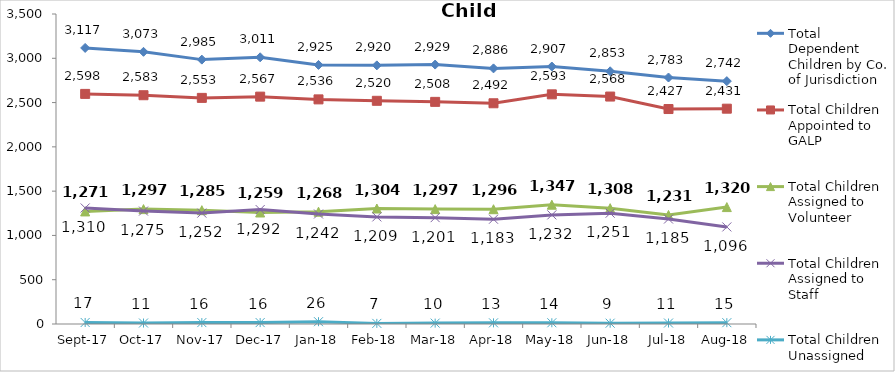
| Category | Total Dependent Children by Co. of Jurisdiction | Total Children Appointed to GALP | Total Children Assigned to Volunteer | Total Children Assigned to Staff | Total Children Unassigned |
|---|---|---|---|---|---|
| 2017-09-01 | 3117 | 2598 | 1271 | 1310 | 17 |
| 2017-10-01 | 3073 | 2583 | 1297 | 1275 | 11 |
| 2017-11-01 | 2985 | 2553 | 1285 | 1252 | 16 |
| 2017-12-01 | 3011 | 2567 | 1259 | 1292 | 16 |
| 2018-01-01 | 2925 | 2536 | 1268 | 1242 | 26 |
| 2018-02-01 | 2920 | 2520 | 1304 | 1209 | 7 |
| 2018-03-01 | 2929 | 2508 | 1297 | 1201 | 10 |
| 2018-04-01 | 2886 | 2492 | 1296 | 1183 | 13 |
| 2018-05-01 | 2907 | 2593 | 1347 | 1232 | 14 |
| 2018-06-01 | 2853 | 2568 | 1308 | 1251 | 9 |
| 2018-07-01 | 2783 | 2427 | 1231 | 1185 | 11 |
| 2018-08-01 | 2742 | 2431 | 1320 | 1096 | 15 |